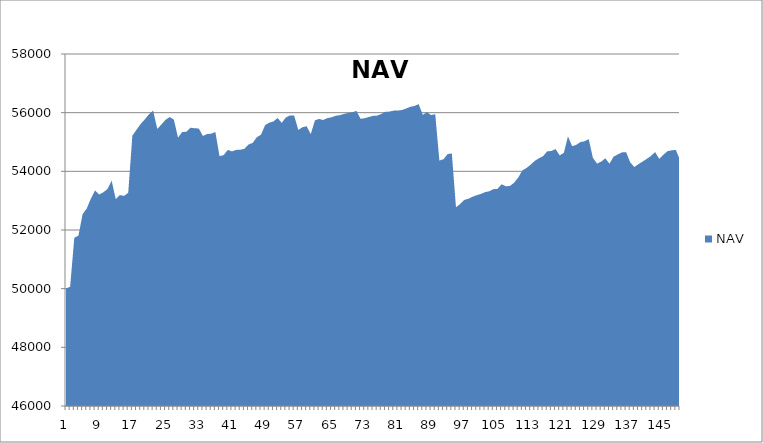
| Category | NAV |
|---|---|
| 0 | 50000 |
| 1 | 50069.444 |
| 2 | 51736.444 |
| 3 | 51809.343 |
| 4 | 52539.343 |
| 5 | 52733.57 |
| 6 | 53070.527 |
| 7 | 53346.212 |
| 8 | 53210.13 |
| 9 | 53285.788 |
| 10 | 53396.685 |
| 11 | 53684.185 |
| 12 | 53050.597 |
| 13 | 53191.058 |
| 14 | 53162.649 |
| 15 | 53270.317 |
| 16 | 55214.762 |
| 17 | 55418.583 |
| 18 | 55617.273 |
| 19 | 55770.477 |
| 20 | 55945.477 |
| 21 | 56069.601 |
| 22 | 55444.601 |
| 23 | 55597.925 |
| 24 | 55757.558 |
| 25 | 55851.308 |
| 26 | 55764.06 |
| 27 | 55148.361 |
| 28 | 55340.028 |
| 29 | 55349.317 |
| 30 | 55485.393 |
| 31 | 55468.704 |
| 32 | 55461.038 |
| 33 | 55205.356 |
| 34 | 55270.356 |
| 35 | 55282.57 |
| 36 | 55341.011 |
| 37 | 54517.482 |
| 38 | 54554.291 |
| 39 | 54731.016 |
| 40 | 54679.093 |
| 41 | 54730.595 |
| 42 | 54736.73 |
| 43 | 54765.085 |
| 44 | 54915.643 |
| 45 | 54969.86 |
| 46 | 55164.665 |
| 47 | 55247.746 |
| 48 | 55575.668 |
| 49 | 55657.905 |
| 50 | 55701.032 |
| 51 | 55819.28 |
| 52 | 55652.834 |
| 53 | 55838.604 |
| 54 | 55905.769 |
| 55 | 55898.888 |
| 56 | 55410.9 |
| 57 | 55504.564 |
| 58 | 55537.603 |
| 59 | 55268.471 |
| 60 | 55737.858 |
| 61 | 55785.708 |
| 62 | 55749.829 |
| 63 | 55815.591 |
| 64 | 55842.34 |
| 65 | 55894.021 |
| 66 | 55916.828 |
| 67 | 55955.697 |
| 68 | 55991.896 |
| 69 | 56012.065 |
| 70 | 56060.293 |
| 71 | 55791.443 |
| 72 | 55810.674 |
| 73 | 55852.843 |
| 74 | 55892.018 |
| 75 | 55900.069 |
| 76 | 55955.739 |
| 77 | 56030.918 |
| 78 | 56036.168 |
| 79 | 56069.975 |
| 80 | 56071.656 |
| 81 | 56090.406 |
| 82 | 56141.798 |
| 83 | 56199.159 |
| 84 | 56228.237 |
| 85 | 56292.573 |
| 86 | 55924.369 |
| 87 | 56019.106 |
| 88 | 55916.165 |
| 89 | 55950.09 |
| 90 | 54367.13 |
| 91 | 54411.811 |
| 92 | 54588.933 |
| 93 | 54611.197 |
| 94 | 52777.117 |
| 95 | 52883.107 |
| 96 | 53025.651 |
| 97 | 53064.908 |
| 98 | 53135.652 |
| 99 | 53186.005 |
| 100 | 53229.789 |
| 101 | 53290.192 |
| 102 | 53319.038 |
| 103 | 53392.112 |
| 104 | 53401.462 |
| 105 | 53559.878 |
| 106 | 53489.526 |
| 107 | 53501.684 |
| 108 | 53607.597 |
| 109 | 53785.178 |
| 110 | 54030.211 |
| 111 | 54113.452 |
| 112 | 54226.272 |
| 113 | 54358.625 |
| 114 | 54444.736 |
| 115 | 54518.421 |
| 116 | 54681.882 |
| 117 | 54693.454 |
| 118 | 54759.719 |
| 119 | 54542.637 |
| 120 | 54631.804 |
| 121 | 55189.582 |
| 122 | 54857.283 |
| 123 | 54902.45 |
| 124 | 54998.878 |
| 125 | 55024.352 |
| 126 | 55097.595 |
| 127 | 54460.788 |
| 128 | 54265.386 |
| 129 | 54330.201 |
| 130 | 54444.032 |
| 131 | 54258.967 |
| 132 | 54502.531 |
| 133 | 54576.689 |
| 134 | 54645.616 |
| 135 | 54655.645 |
| 136 | 54306.491 |
| 137 | 54146.917 |
| 138 | 54245.601 |
| 139 | 54336.218 |
| 140 | 54425.943 |
| 141 | 54524.223 |
| 142 | 54658.516 |
| 143 | 54423.271 |
| 144 | 54567.668 |
| 145 | 54687.668 |
| 146 | 54715.668 |
| 147 | 54729.584 |
| 148 | 54383.43 |